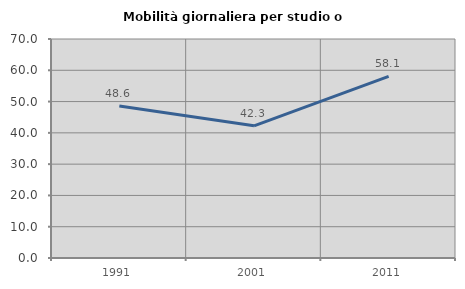
| Category | Mobilità giornaliera per studio o lavoro |
|---|---|
| 1991.0 | 48.598 |
| 2001.0 | 42.254 |
| 2011.0 | 58.065 |